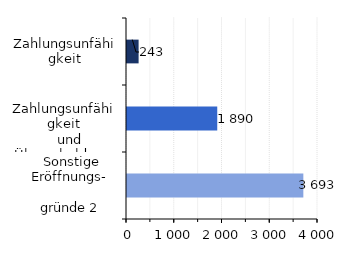
| Category | Series 0 |
|---|---|
| Zahlungsunfähigkeit | 243 |
|   Zahlungsunfähigkeit
   und Überschuldung | 1890 |
|  Sonstige Eröffnungs-
                      gründe 2 | 3693 |